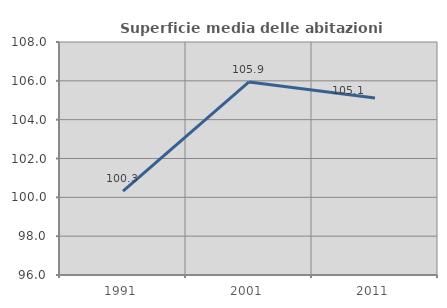
| Category | Superficie media delle abitazioni occupate |
|---|---|
| 1991.0 | 100.322 |
| 2001.0 | 105.942 |
| 2011.0 | 105.115 |